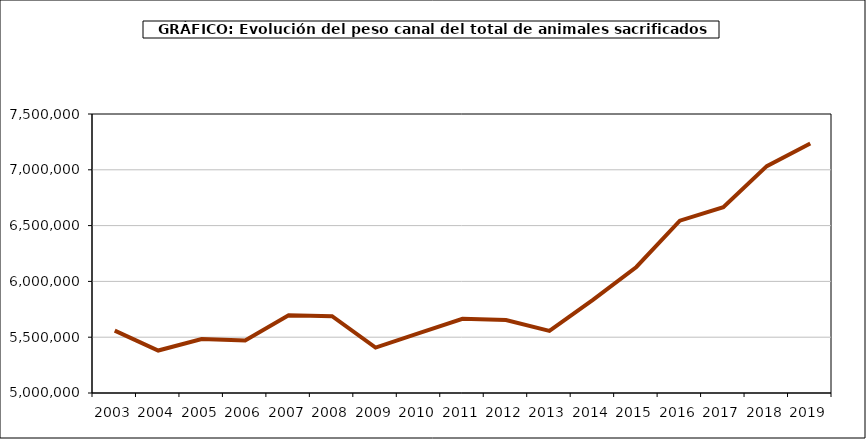
| Category | Series 0 |
|---|---|
| 2003.0 | 5559491.635 |
| 2004.0 | 5380320.91 |
| 2005.0 | 5484133.682 |
| 2006.0 | 5469928.516 |
| 2007.0 | 5697170.115 |
| 2008.0 | 5687912.363 |
| 2009.0 | 5406476.675 |
| 2010.0 | 5537415.454 |
| 2011.0 | 5664197.217 |
| 2012.0 | 5653769.803 |
| 2013.0 | 5556795.031 |
| 2014.0 | 5833789.68 |
| 2015.0 | 6129137.234 |
| 2016.0 | 6544369.423 |
| 2017.0 | 6665614.034 |
| 2018.0 | 7032931.593 |
| 2019.0 | 7235051.281 |